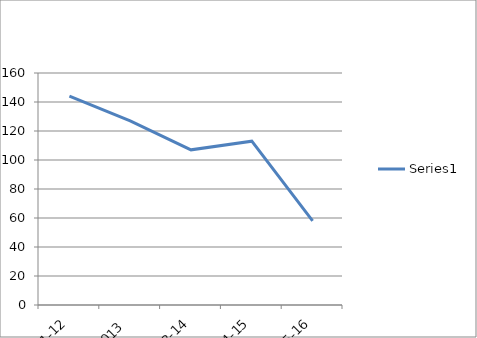
| Category | Series 0 |
|---|---|
| 2011-12 | 144 |
| 2012-2013 | 127 |
| 2013-14 | 107 |
| 2014-15 | 113 |
| 2015-16 | 58 |